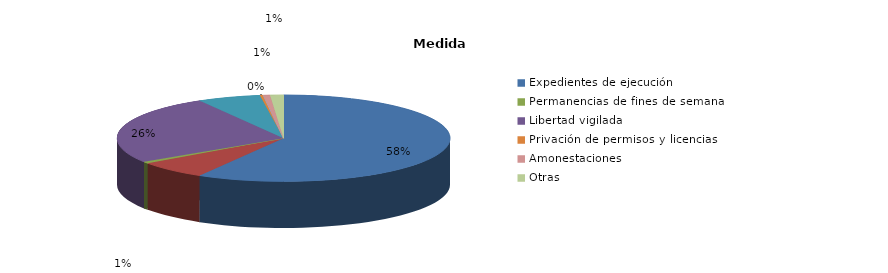
| Category | Series 0 |
|---|---|
| Expedientes de ejecución | 181 |
| Internamientos | 21 |
| Permanencias de fines de semana | 2 |
| Libertad vigilada | 80 |
| Prestaciones en beneficio de la comunidad | 19 |
| Privación de permisos y licencias | 1 |
| Convivencia Familiar Educativa | 0 |
| Amonestaciones | 2 |
| Otras | 4 |